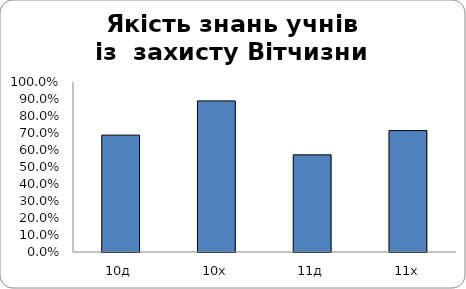
| Category | Series 0 |
|---|---|
| 10д | 0.688 |
| 10х | 0.889 |
| 11д | 0.571 |
| 11х | 0.714 |